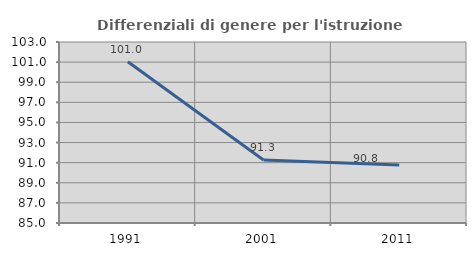
| Category | Differenziali di genere per l'istruzione superiore |
|---|---|
| 1991.0 | 101.035 |
| 2001.0 | 91.259 |
| 2011.0 | 90.758 |